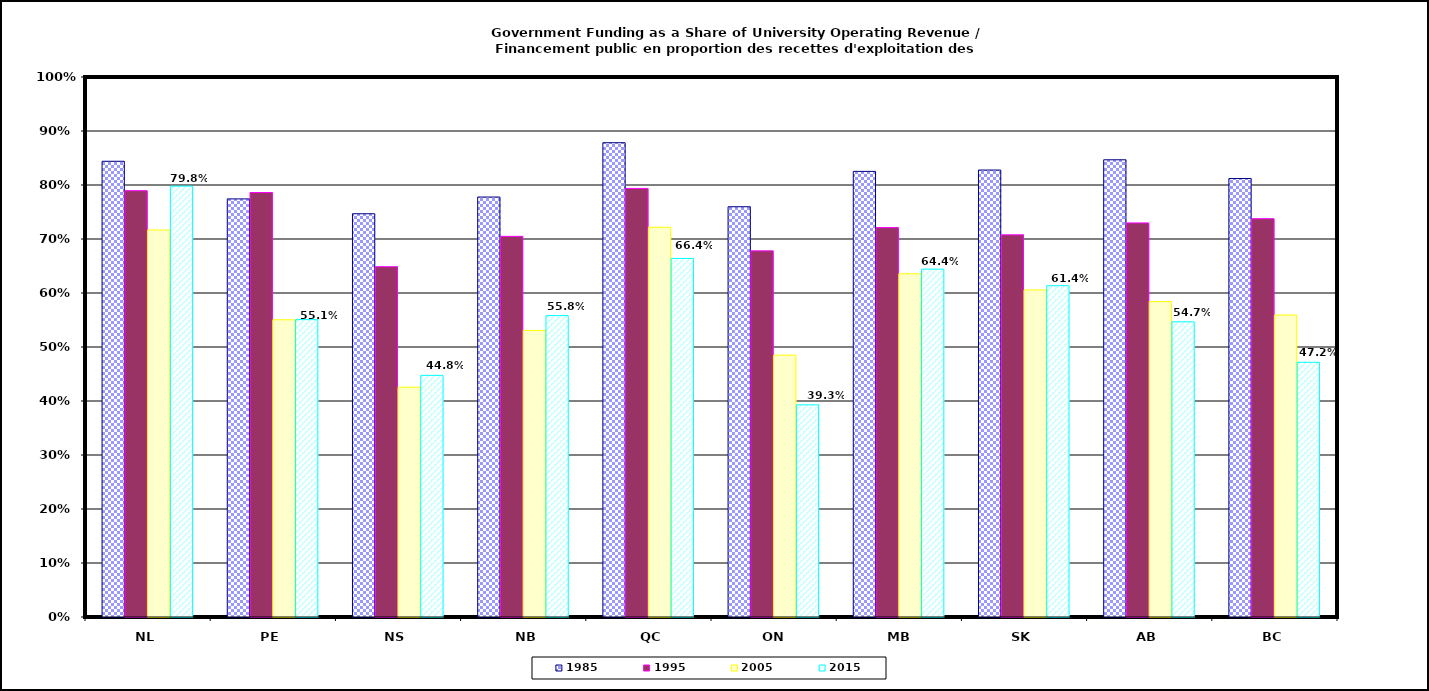
| Category | 1985 | 1995 | 2005 | 2015 |
|---|---|---|---|---|
| NL | 0.844 | 0.79 | 0.717 | 0.798 |
| PE | 0.774 | 0.786 | 0.55 | 0.551 |
| NS | 0.747 | 0.649 | 0.425 | 0.448 |
| NB | 0.778 | 0.705 | 0.531 | 0.558 |
| QC | 0.878 | 0.794 | 0.722 | 0.664 |
| ON | 0.76 | 0.678 | 0.485 | 0.393 |
| MB | 0.825 | 0.721 | 0.636 | 0.644 |
| SK | 0.828 | 0.708 | 0.606 | 0.614 |
| AB | 0.847 | 0.73 | 0.584 | 0.547 |
| BC | 0.812 | 0.738 | 0.559 | 0.472 |